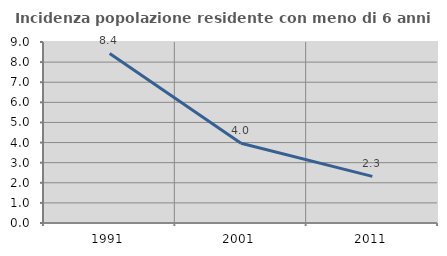
| Category | Incidenza popolazione residente con meno di 6 anni |
|---|---|
| 1991.0 | 8.43 |
| 2001.0 | 3.965 |
| 2011.0 | 2.319 |